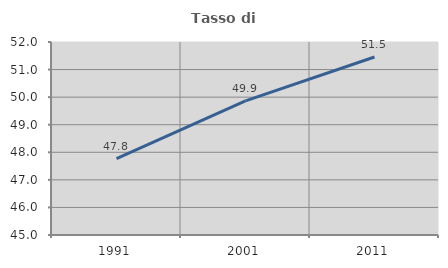
| Category | Tasso di occupazione   |
|---|---|
| 1991.0 | 47.772 |
| 2001.0 | 49.862 |
| 2011.0 | 51.456 |